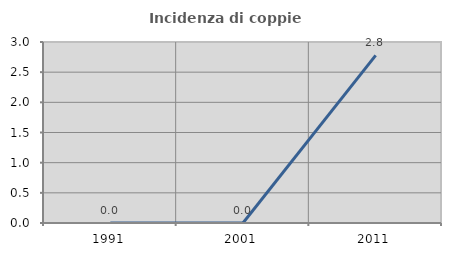
| Category | Incidenza di coppie miste |
|---|---|
| 1991.0 | 0 |
| 2001.0 | 0 |
| 2011.0 | 2.778 |